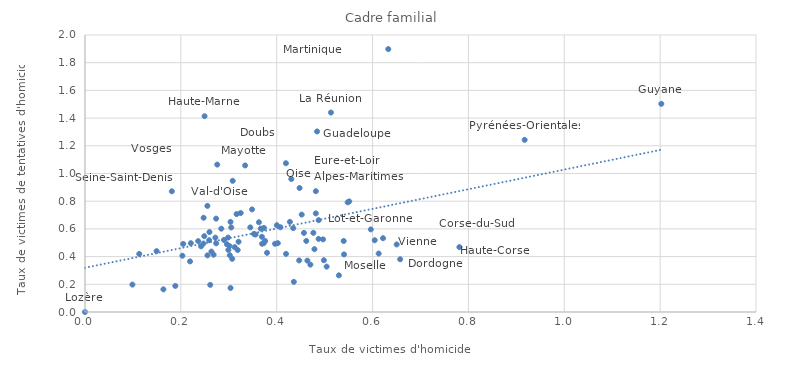
| Category | Series 0 |
|---|---|
| 1.2024463771543206 | 1.503 |
| 0.4841870109012843 | 1.304 |
| 0.6327674678425596 | 1.898 |
| 0.3341455018209677 | 1.058 |
| 0.7811224573487611 | 0.469 |
| 0.27203311270750374 | 0.537 |
| 0.6218364072779733 | 0.533 |
| 0.18122267313108079 | 0.872 |
| 0.5131107238320566 | 1.44 |
| 0.11317231176814961 | 0.419 |
| 0.4344207059125843 | 0.606 |
| 0.4966938128231442 | 0.524 |
| 0.35590925025936887 | 0.559 |
| 0.9173348168511447 | 1.243 |
| 0.2590322382889366 | 0.518 |
| 0.6045145143934906 | 0.518 |
| 0.39650065344509206 | 0.493 |
| 0.32485990416632826 | 0.715 |
| 0.5397210397833776 | 0.513 |
| 0.3013001594918699 | 0.477 |
| 0.4521208991378557 | 0.703 |
| 0.46396047799064283 | 0.371 |
| 0.4568784767976169 | 0.571 |
| 0.263803947399928 | 0.436 |
| 0.3051842798051551 | 0.61 |
| 0.273566562506198 | 0.674 |
| 0.28437596865564324 | 0.602 |
| 0.41923634527571735 | 1.074 |
| 0.48165355570974255 | 0.872 |
| 0.30365140818340547 | 0.174 |
| 0.40781371069695366 | 0.612 |
| 0.20320350322839567 | 0.406 |
| 0.4874034636514805 | 0.528 |
| 0.2960205839051559 | 0.49 |
| 0.6127380061641443 | 0.422 |
| 0.24217230983646407 | 0.474 |
| 0.504208502316712 | 0.328 |
| 0.4787159125925213 | 0.454 |
| 0.5513099409356946 | 0.798 |
| 0.36947405368458 | 0.493 |
| 0.4702679501276564 | 0.342 |
| 0.318566535541141 | 0.448 |
| 0.34858668795369374 | 0.741 |
| 0.26837859407860654 | 0.414 |
| 0.09894592901816944 | 0.198 |
| 0.48156163318906026 | 0.712 |
| 0.5296871085281214 | 0.265 |
| 0.37301462963377424 | 0.497 |
| 0.247128441646599 | 0.494 |
| 0.3081267400601737 | 0.947 |
| 0.14933907357593554 | 0.439 |
| 0.47645411413363015 | 0.572 |
| 0.5963179659135477 | 0.596 |
| 0.4275445780283726 | 0.651 |
| 0.43044918034198193 | 0.96 |
| 0.3122543436530792 | 0.468 |
| 0.36666053528771547 | 0.602 |
| 0.40232115641299926 | 0.497 |
| 0.6503379806485431 | 0.488 |
| 0.24946240850966167 | 1.414 |
| 0.5404641339685866 | 0.416 |
| 0.31628530720791886 | 0.707 |
| 0.40034875598586667 | 0.627 |
| 0.2047993079421786 | 0.492 |
| 0.36293490943866674 | 0.648 |
| 0.46169828017390635 | 0.513 |
| 0.3524378123480112 | 0.564 |
| 0.2555090302001453 | 0.409 |
| 0.30218236101122303 | 0.41 |
| 0.25538478826047206 | 0.766 |
| 0.25969146922179986 | 0.577 |
| 0.37583015756850185 | 0.512 |
| 0.48750714197963 | 0.663 |
| 0.2991142292938642 | 0.449 |
| 0.3734101189007833 | 0.607 |
| 0.23615895334351877 | 0.512 |
| 0.3797712922335347 | 0.427 |
| 0.3036219057132534 | 0.651 |
| 0.4984227257087844 | 0.374 |
| 0.2736707214404932 | 0.496 |
| 0.4194306368914411 | 0.419 |
| 0.32038052663083033 | 0.507 |
| 0.18839215459711395 | 0.188 |
| 0.4476666495061118 | 0.895 |
| 0.6575193042476786 | 0.381 |
| 0.2899868925924548 | 0.52 |
| 0.27594047412092265 | 1.064 |
| 0.3071181149397223 | 0.384 |
| 0.2612758491628395 | 0.196 |
| 0.3691645935541256 | 0.543 |
| 0.44684982047808464 | 0.372 |
| 0.21918112470602333 | 0.365 |
| 0.43567954027094913 | 0.218 |
| 0.34489347275307075 | 0.611 |
| 0.24886421483153573 | 0.548 |
| 0.5480429690045164 | 0.792 |
| 0.2986269134519479 | 0.538 |
| 0.16357375949750141 | 0.164 |
| 0.2474770233051175 | 0.681 |
| 0.22080099978692702 | 0.497 |
| 0.0 | 0 |